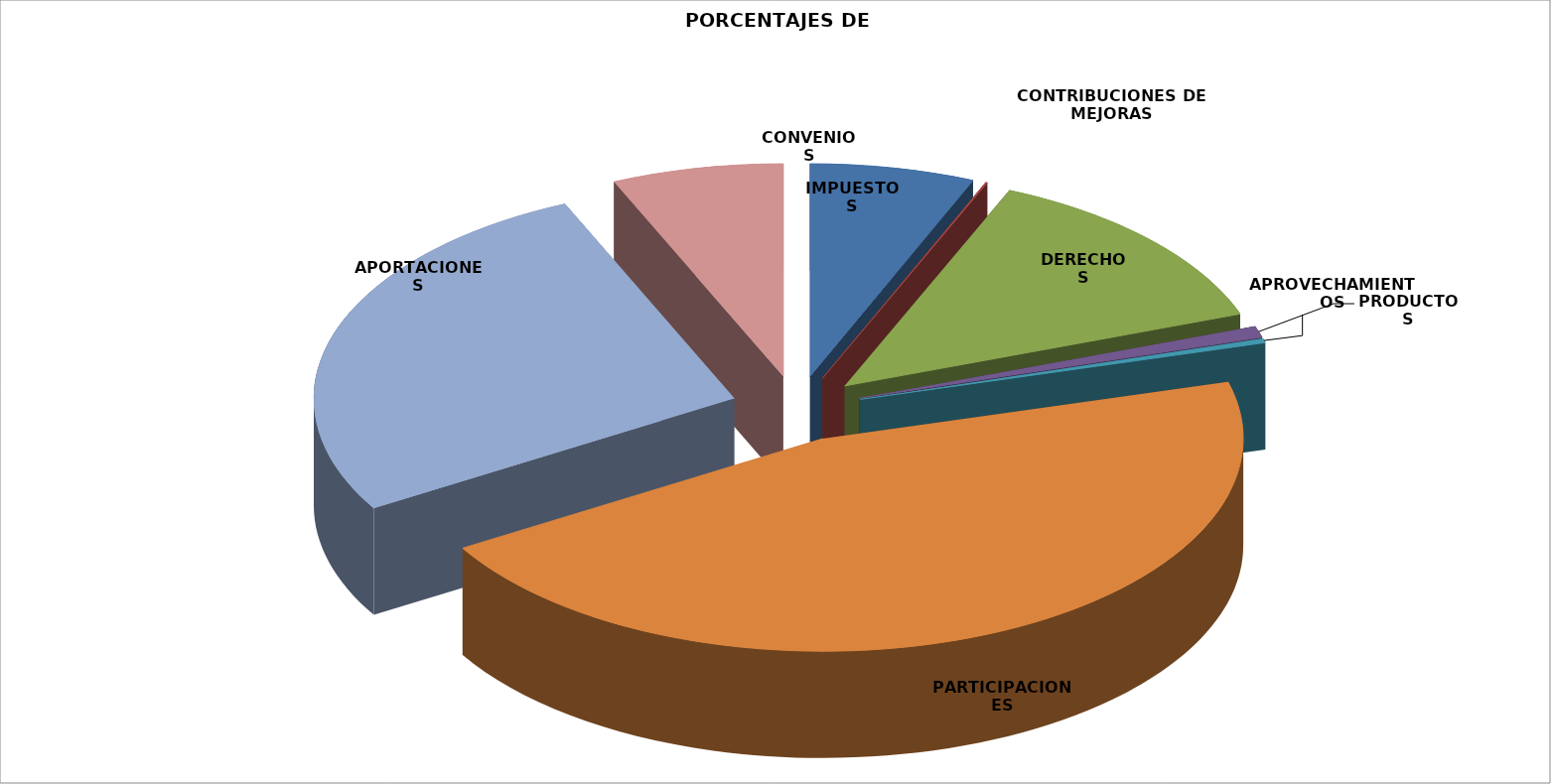
| Category | TOTAL | PORCENTAJE |
|---|---|---|
| IMPUESTOS | 1915383.49 | 0.063 |
| CONTRIBUCIONES DE MEJORAS | 20000 | 0.001 |
| DERECHOS | 3954446.331 | 0.131 |
| PRODUCTOS | 263652.42 | 0.009 |
| APROVECHAMIENTOS | 99044.48 | 0.003 |
| PARTICIPACIONES | 13800866.21 | 0.457 |
| APORTACIONES | 8162531.49 | 0.27 |
| CONVENIOS | 1993041.93 | 0.066 |